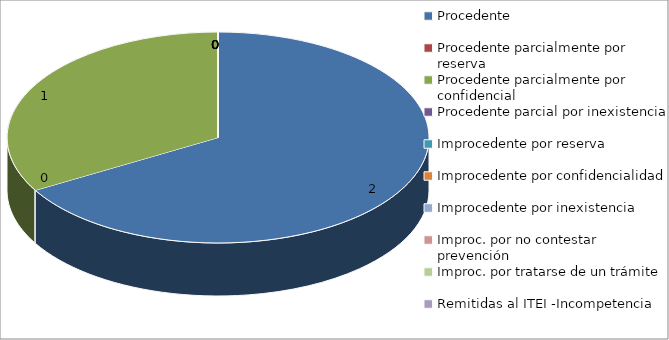
| Category | Series 0 |
|---|---|
| Procedente | 2 |
| Procedente parcialmente por reserva  | 0 |
| Procedente parcialmente por confidencial | 1 |
| Procedente parcial por inexistencia | 0 |
| Improcedente por reserva  | 0 |
| Improcedente por confidencialidad | 0 |
| Improcedente por inexistencia  | 0 |
| Improc. por no contestar prevención | 0 |
| Improc. por tratarse de un trámite  | 0 |
| Remitidas al ITEI -Incompetencia  | 0 |